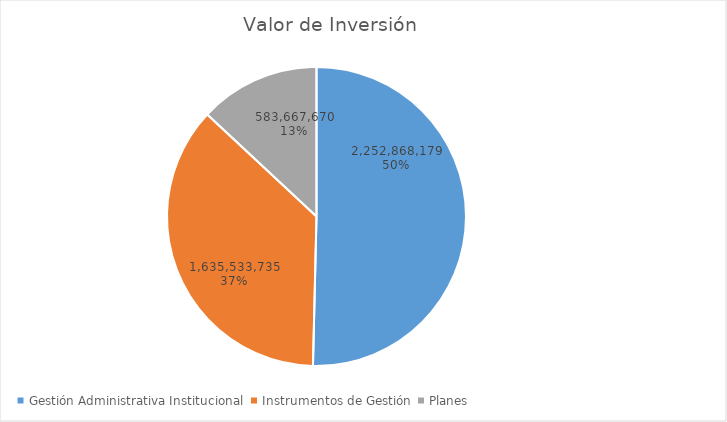
| Category | Valor de Inversión | Porcentaje de Ejecución dentro de la Actividad |
|---|---|---|
| Gestión Administrativa Institucional | 2252868179 | 7 |
| Instrumentos de Gestión | 1635533735 | 6 |
| Planes | 583667670 | 5 |